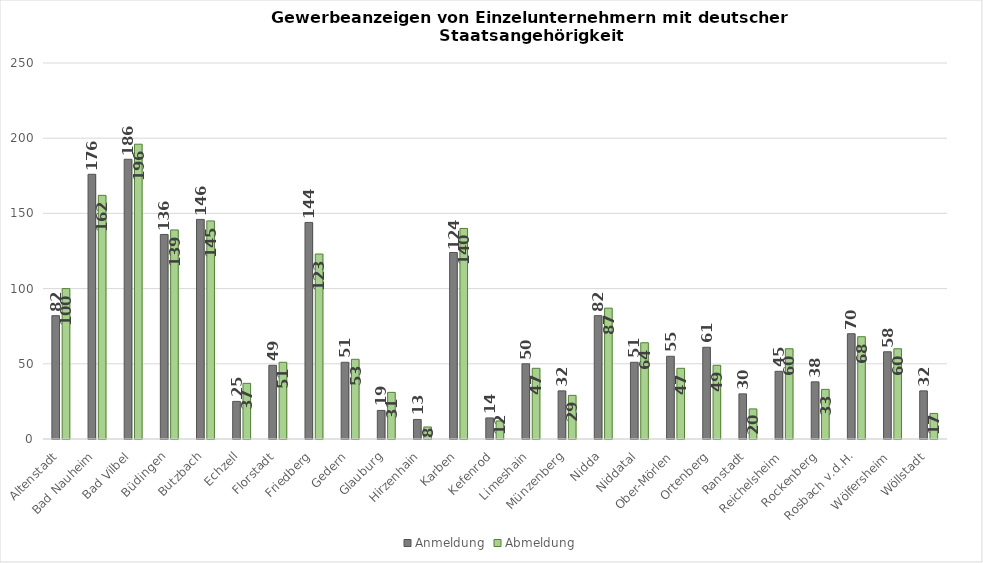
| Category | Anmeldung | Abmeldung |
|---|---|---|
| Altenstadt | 82 | 100 |
| Bad Nauheim | 176 | 162 |
| Bad Vilbel | 186 | 196 |
| Büdingen | 136 | 139 |
| Butzbach | 146 | 145 |
| Echzell | 25 | 37 |
| Florstadt | 49 | 51 |
| Friedberg | 144 | 123 |
| Gedern | 51 | 53 |
| Glauburg | 19 | 31 |
| Hirzenhain | 13 | 8 |
| Karben | 124 | 140 |
| Kefenrod | 14 | 12 |
| Limeshain | 50 | 47 |
| Münzenberg | 32 | 29 |
| Nidda | 82 | 87 |
| Niddatal | 51 | 64 |
| Ober-Mörlen | 55 | 47 |
| Ortenberg | 61 | 49 |
| Ranstadt | 30 | 20 |
| Reichelsheim | 45 | 60 |
| Rockenberg | 38 | 33 |
| Rosbach v.d.H. | 70 | 68 |
| Wölfersheim | 58 | 60 |
| Wöllstadt | 32 | 17 |